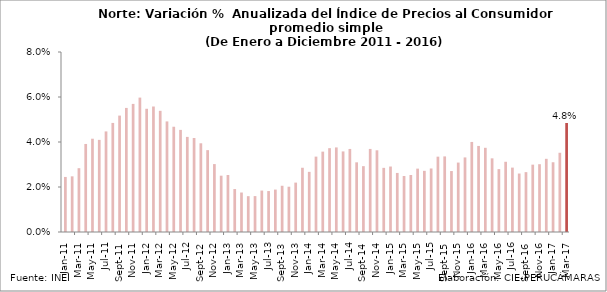
| Category | IPC Norte |
|---|---|
| 2011-01-01 | 0.024 |
| 2011-02-01 | 0.025 |
| 2011-03-01 | 0.028 |
| 2011-04-01 | 0.039 |
| 2011-05-01 | 0.041 |
| 2011-06-01 | 0.041 |
| 2011-07-01 | 0.045 |
| 2011-08-01 | 0.048 |
| 2011-09-01 | 0.052 |
| 2011-10-01 | 0.055 |
| 2011-11-01 | 0.057 |
| 2011-12-01 | 0.06 |
| 2012-01-01 | 0.055 |
| 2012-02-01 | 0.056 |
| 2012-03-01 | 0.054 |
| 2012-04-01 | 0.049 |
| 2012-05-01 | 0.047 |
| 2012-06-01 | 0.045 |
| 2012-07-01 | 0.042 |
| 2012-08-01 | 0.042 |
| 2012-09-01 | 0.039 |
| 2012-10-01 | 0.036 |
| 2012-11-01 | 0.03 |
| 2012-12-01 | 0.025 |
| 2013-01-01 | 0.025 |
| 2013-02-01 | 0.019 |
| 2013-03-01 | 0.018 |
| 2013-04-01 | 0.016 |
| 2013-05-01 | 0.016 |
| 2013-06-01 | 0.018 |
| 2013-07-01 | 0.018 |
| 2013-08-01 | 0.019 |
| 2013-09-01 | 0.021 |
| 2013-10-01 | 0.02 |
| 2013-11-01 | 0.022 |
| 2013-12-01 | 0.029 |
| 2014-01-01 | 0.027 |
| 2014-02-01 | 0.033 |
| 2014-03-01 | 0.036 |
| 2014-04-01 | 0.037 |
| 2014-05-01 | 0.038 |
| 2014-06-01 | 0.036 |
| 2014-07-01 | 0.037 |
| 2014-08-01 | 0.031 |
| 2014-09-01 | 0.029 |
| 2014-10-01 | 0.037 |
| 2014-11-01 | 0.036 |
| 2014-12-01 | 0.029 |
| 2015-01-01 | 0.029 |
| 2015-02-01 | 0.026 |
| 2015-03-01 | 0.025 |
| 2015-04-01 | 0.025 |
| 2015-05-01 | 0.028 |
| 2015-06-01 | 0.027 |
| 2015-07-01 | 0.028 |
| 2015-08-01 | 0.033 |
| 2015-09-01 | 0.034 |
| 2015-10-01 | 0.027 |
| 2015-11-01 | 0.031 |
| 2015-12-01 | 0.033 |
| 2016-01-01 | 0.04 |
| 2016-02-01 | 0.038 |
| 2016-03-01 | 0.037 |
| 2016-04-01 | 0.033 |
| 2016-05-01 | 0.028 |
| 2016-06-01 | 0.031 |
| 2016-07-01 | 0.029 |
| 2016-08-01 | 0.026 |
| 2016-09-01 | 0.027 |
| 2016-10-01 | 0.03 |
| 2016-11-01 | 0.03 |
| 2016-12-01 | 0.033 |
| 2017-01-01 | 0.031 |
| 2017-02-01 | 0.035 |
| 2017-03-01 | 0.048 |